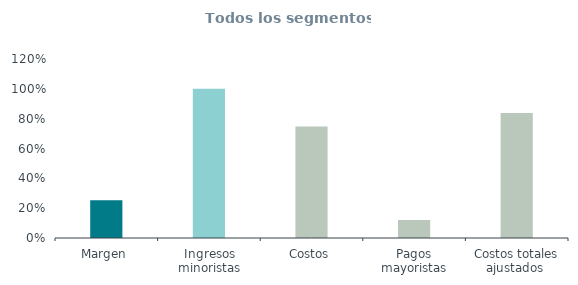
| Category | Todos los segmentos 
(% ingresos) |
|---|---|
| Margen | 0.253 |
| Ingresos minoristas | 1 |
| Costos | 0.747 |
| Pagos mayoristas | 0.122 |
| Costos totales ajustados  | 0.837 |